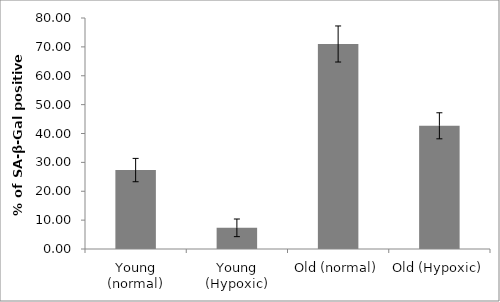
| Category | Series 0 |
|---|---|
| Young (normal) | 27.333 |
| Young (Hypoxic) | 7.333 |
| Old (normal) | 71 |
| Old (Hypoxic) | 42.667 |